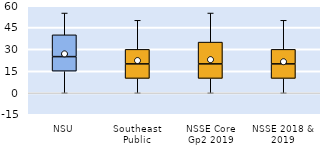
| Category | 25th | 50th | 75th |
|---|---|---|---|
| NSU | 15 | 10 | 15 |
| Southeast Public | 10 | 10 | 10 |
| NSSE Core Gp2 2019 | 10 | 10 | 15 |
| NSSE 2018 & 2019 | 10 | 10 | 10 |